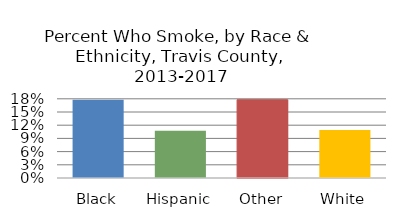
| Category | Series 0 |
|---|---|
| Black | 0.178 |
| Hispanic | 0.107 |
| Other | 0.178 |
| White | 0.109 |